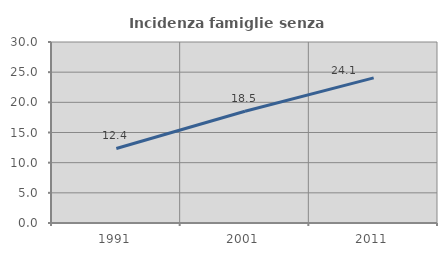
| Category | Incidenza famiglie senza nuclei |
|---|---|
| 1991.0 | 12.355 |
| 2001.0 | 18.529 |
| 2011.0 | 24.061 |